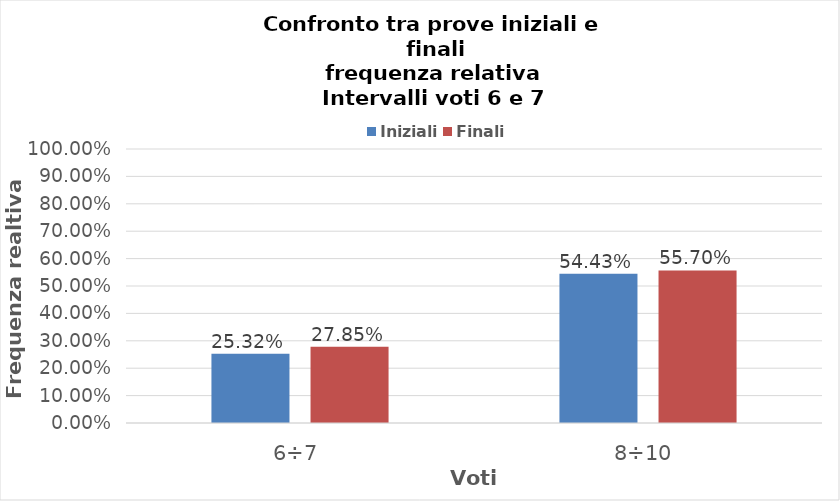
| Category | Iniziali | Finali |
|---|---|---|
| 6÷7 | 0.253 | 0.278 |
| 8÷10 | 0.544 | 0.557 |